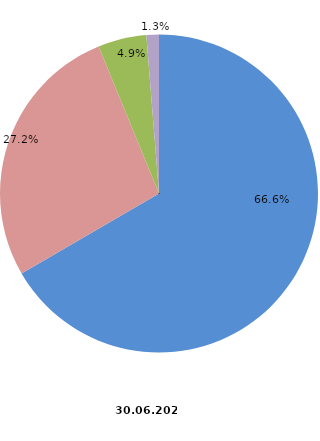
| Category | Anzahl Betriebe 2021 |
|---|---|
| 1 - 19 Beschäftigte | 473 |
| 20 - 49 Beschäftigte | 193 |
| 50 - 99 Beschäftigte | 35 |
| 100 und mehr Beschäftigte | 9 |